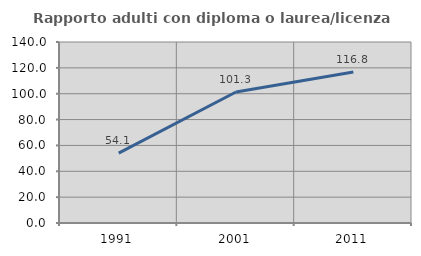
| Category | Rapporto adulti con diploma o laurea/licenza media  |
|---|---|
| 1991.0 | 54.106 |
| 2001.0 | 101.32 |
| 2011.0 | 116.825 |